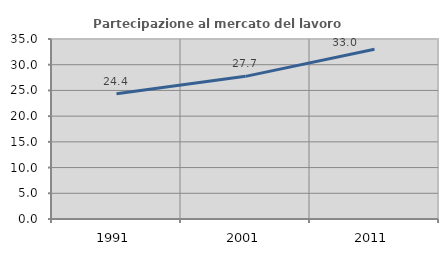
| Category | Partecipazione al mercato del lavoro  femminile |
|---|---|
| 1991.0 | 24.355 |
| 2001.0 | 27.736 |
| 2011.0 | 33.025 |